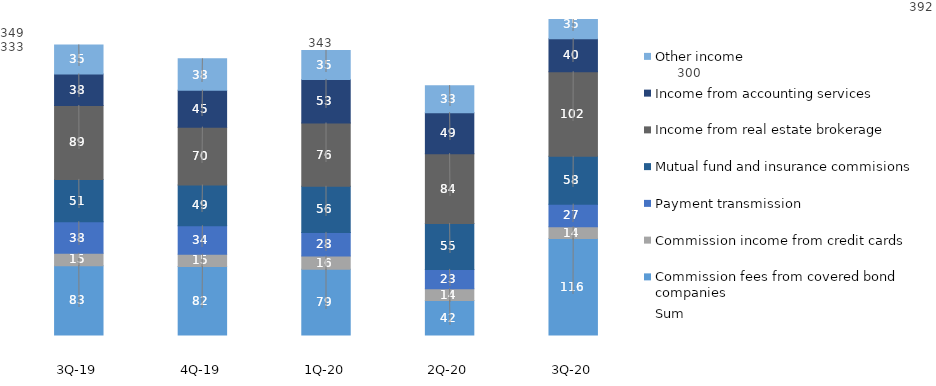
| Category | Commission fees from covered bond companies | Commission income from credit cards | Payment transmission | Mutual fund and insurance commisions | Income from real estate brokerage | Income from accounting services | Other income |
|---|---|---|---|---|---|---|---|
| 3Q-20 | 116.034 | 14.295 | 27.183 | 57.628 | 101.952 | 39.804 | 35.242 |
| 2Q-20 | 41.55 | 14.097 | 23.262 | 55.386 | 84.016 | 49.478 | 32.501 |
| 1Q-20 | 78.983 | 16.14 | 28.326 | 55.562 | 76.287 | 52.513 | 34.973 |
| 4Q-19 | 82.3 | 14.8 | 34.4 | 49.1 | 69.7 | 44.5 | 37.8 |
| 3Q-19 | 83.345 | 15 | 38 | 51 | 89 | 38 | 35 |